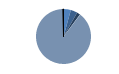
| Category | Series 0 |
|---|---|
| ARRASTRE | 24 |
| CERCO | 22 |
| PALANGRE | 11 |
| REDES DE ENMALLE | 0 |
| ARTES FIJAS | 1 |
| ARTES MENORES | 496 |
| SIN TIPO ASIGNADO | 2 |